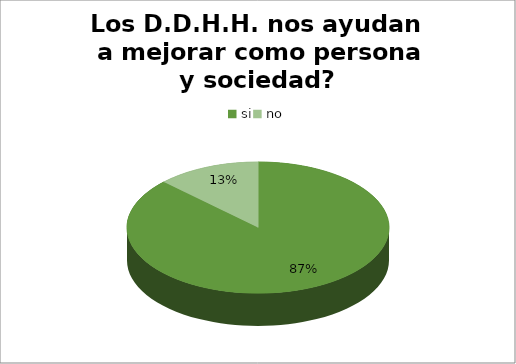
| Category | Series 0 |
|---|---|
| si | 82 |
| no | 12 |